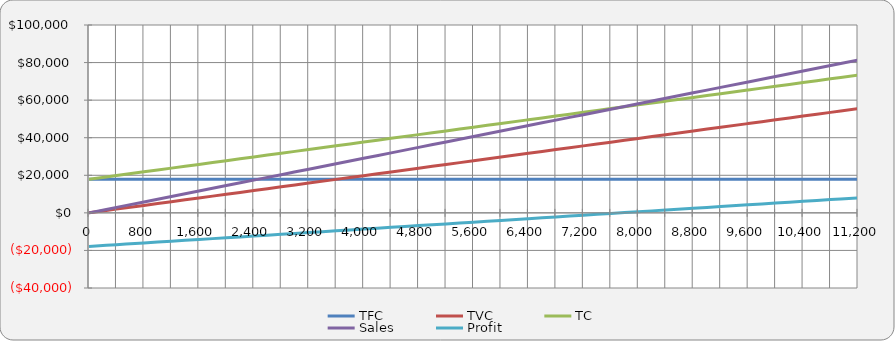
| Category | TFC | TVC | TC | Sales | Profit |
|---|---|---|---|---|---|
| 0.0 | 17870 | 0 | 17870 | 0 | -17870 |
| 400.0 | 17870 | 1980.8 | 19850.8 | 2904 | -16946.8 |
| 800.0 | 17870 | 3961.6 | 21831.6 | 5808 | -16023.6 |
| 1200.0 | 17870 | 5942.4 | 23812.4 | 8712 | -15100.4 |
| 1600.0 | 17870 | 7923.2 | 25793.2 | 11616 | -14177.2 |
| 2000.0 | 17870 | 9904 | 27774 | 14520 | -13254 |
| 2400.0 | 17870 | 11884.8 | 29754.8 | 17424 | -12330.8 |
| 2800.0 | 17870 | 13865.6 | 31735.6 | 20328 | -11407.6 |
| 3200.0 | 17870 | 15846.4 | 33716.4 | 23232 | -10484.4 |
| 3600.0 | 17870 | 17827.2 | 35697.2 | 26136 | -9561.2 |
| 4000.0 | 17870 | 19808 | 37678 | 29040 | -8638 |
| 4400.0 | 17870 | 21788.8 | 39658.8 | 31944 | -7714.8 |
| 4800.0 | 17870 | 23769.6 | 41639.6 | 34848 | -6791.6 |
| 5200.0 | 17870 | 25750.4 | 43620.4 | 37752 | -5868.4 |
| 5600.0 | 17870 | 27731.2 | 45601.2 | 40656 | -4945.2 |
| 6000.0 | 17870 | 29712 | 47582 | 43560 | -4022 |
| 6400.0 | 17870 | 31692.8 | 49562.8 | 46464 | -3098.8 |
| 6800.0 | 17870 | 33673.6 | 51543.6 | 49368 | -2175.6 |
| 7200.0 | 17870 | 35654.4 | 53524.4 | 52272 | -1252.4 |
| 7600.0 | 17870 | 37635.2 | 55505.2 | 55176 | -329.2 |
| 8000.0 | 17870 | 39616 | 57486 | 58080 | 594 |
| 8400.0 | 17870 | 41596.8 | 59466.8 | 60984 | 1517.2 |
| 8800.0 | 17870 | 43577.6 | 61447.6 | 63888 | 2440.4 |
| 9200.0 | 17870 | 45558.4 | 63428.4 | 66792 | 3363.6 |
| 9600.0 | 17870 | 47539.2 | 65409.2 | 69696 | 4286.8 |
| 10000.0 | 17870 | 49520 | 67390 | 72600 | 5210 |
| 10400.0 | 17870 | 51500.8 | 69370.8 | 75504 | 6133.2 |
| 10800.0 | 17870 | 53481.6 | 71351.6 | 78408 | 7056.4 |
| 11200.0 | 17870 | 55462.4 | 73332.4 | 81312 | 7979.6 |